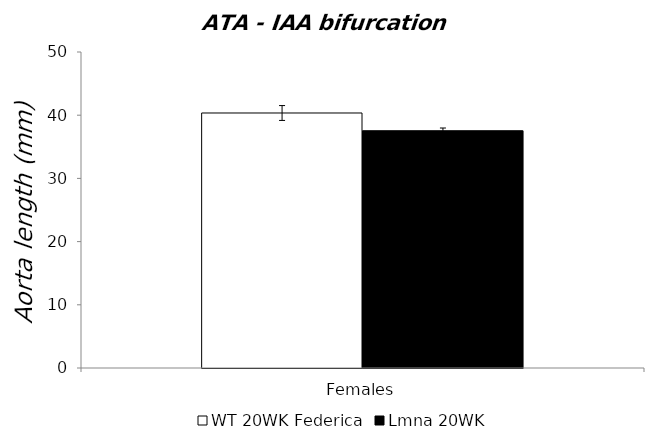
| Category | WT 20WK Federica | Lmna 20WK |
|---|---|---|
| 0 | 40.348 | 37.544 |